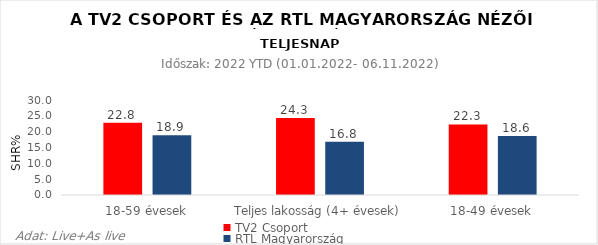
| Category | TV2 Csoport | RTL Magyarország |
|---|---|---|
| 18-59 évesek | 22.8 | 18.9 |
| Teljes lakosság (4+ évesek) | 24.3 | 16.8 |
| 18-49 évesek | 22.3 | 18.6 |